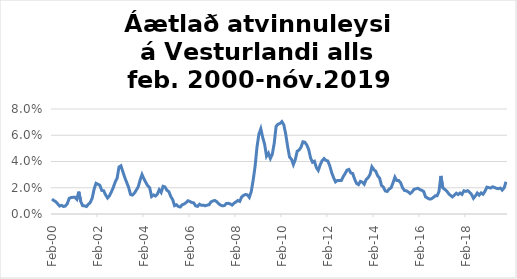
| Category | Series 0 |
|---|---|
| 2000-02-01 | 0.011 |
| 2000-03-01 | 0.01 |
| 2000-04-01 | 0.009 |
| 2000-05-01 | 0.008 |
| 2000-06-01 | 0.006 |
| 2000-07-01 | 0.007 |
| 2000-08-01 | 0.006 |
| 2000-09-01 | 0.006 |
| 2000-10-01 | 0.008 |
| 2000-11-01 | 0.012 |
| 2000-12-01 | 0.013 |
| 2001-01-01 | 0.013 |
| 2001-02-01 | 0.013 |
| 2001-03-01 | 0.011 |
| 2001-04-01 | 0.017 |
| 2001-05-01 | 0.01 |
| 2001-06-01 | 0.006 |
| 2001-07-01 | 0.006 |
| 2001-08-01 | 0.006 |
| 2001-09-01 | 0.007 |
| 2001-10-01 | 0.009 |
| 2001-11-01 | 0.012 |
| 2001-12-01 | 0.019 |
| 2002-01-01 | 0.023 |
| 2002-02-01 | 0.023 |
| 2002-03-01 | 0.022 |
| 2002-04-01 | 0.018 |
| 2002-05-01 | 0.018 |
| 2002-06-01 | 0.015 |
| 2002-07-01 | 0.012 |
| 2002-08-01 | 0.014 |
| 2002-09-01 | 0.017 |
| 2002-10-01 | 0.02 |
| 2002-11-01 | 0.024 |
| 2002-12-01 | 0.027 |
| 2003-01-01 | 0.036 |
| 2003-02-01 | 0.037 |
| 2003-03-01 | 0.032 |
| 2003-04-01 | 0.028 |
| 2003-05-01 | 0.024 |
| 2003-06-01 | 0.02 |
| 2003-07-01 | 0.015 |
| 2003-08-01 | 0.014 |
| 2003-09-01 | 0.016 |
| 2003-10-01 | 0.018 |
| 2003-11-01 | 0.021 |
| 2003-12-01 | 0.026 |
| 2004-01-01 | 0.03 |
| 2004-02-01 | 0.027 |
| 2004-03-01 | 0.024 |
| 2004-04-01 | 0.021 |
| 2004-05-01 | 0.02 |
| 2004-06-01 | 0.013 |
| 2004-07-01 | 0.014 |
| 2004-08-01 | 0.014 |
| 2004-09-01 | 0.015 |
| 2004-10-01 | 0.019 |
| 2004-11-01 | 0.016 |
| 2004-12-01 | 0.021 |
| 2005-01-01 | 0.021 |
| 2005-02-01 | 0.018 |
| 2005-03-01 | 0.017 |
| 2005-04-01 | 0.013 |
| 2005-05-01 | 0.011 |
| 2005-06-01 | 0.006 |
| 2005-07-01 | 0.007 |
| 2005-08-01 | 0.006 |
| 2005-09-01 | 0.005 |
| 2005-10-01 | 0.007 |
| 2005-11-01 | 0.008 |
| 2005-12-01 | 0.009 |
| 2006-01-01 | 0.01 |
| 2006-02-01 | 0.009 |
| 2006-03-01 | 0.009 |
| 2006-04-01 | 0.008 |
| 2006-05-01 | 0.006 |
| 2006-06-01 | 0.006 |
| 2006-07-01 | 0.007 |
| 2006-08-01 | 0.007 |
| 2006-09-01 | 0.007 |
| 2006-10-01 | 0.006 |
| 2006-11-01 | 0.007 |
| 2006-12-01 | 0.007 |
| 2007-01-01 | 0.009 |
| 2007-02-01 | 0.01 |
| 2007-03-01 | 0.01 |
| 2007-04-01 | 0.009 |
| 2007-05-01 | 0.008 |
| 2007-06-01 | 0.007 |
| 2007-07-01 | 0.006 |
| 2007-08-01 | 0.006 |
| 2007-09-01 | 0.008 |
| 2007-10-01 | 0.008 |
| 2007-11-01 | 0.008 |
| 2007-12-01 | 0.007 |
| 2008-01-01 | 0.008 |
| 2008-02-01 | 0.009 |
| 2008-03-01 | 0.01 |
| 2008-04-01 | 0.01 |
| 2008-05-01 | 0.013 |
| 2008-06-01 | 0.014 |
| 2008-07-01 | 0.015 |
| 2008-08-01 | 0.015 |
| 2008-09-01 | 0.013 |
| 2008-10-01 | 0.017 |
| 2008-11-01 | 0.026 |
| 2008-12-01 | 0.036 |
| 2009-01-01 | 0.051 |
| 2009-02-01 | 0.061 |
| 2009-03-01 | 0.065 |
| 2009-04-01 | 0.058 |
| 2009-05-01 | 0.053 |
| 2009-06-01 | 0.044 |
| 2009-07-01 | 0.046 |
| 2009-08-01 | 0.042 |
| 2009-09-01 | 0.046 |
| 2009-10-01 | 0.054 |
| 2009-11-01 | 0.067 |
| 2009-12-01 | 0.068 |
| 2010-01-01 | 0.069 |
| 2010-02-01 | 0.07 |
| 2010-03-01 | 0.068 |
| 2010-04-01 | 0.061 |
| 2010-05-01 | 0.052 |
| 2010-06-01 | 0.043 |
| 2010-07-01 | 0.042 |
| 2010-08-01 | 0.038 |
| 2010-09-01 | 0.041 |
| 2010-10-01 | 0.048 |
| 2010-11-01 | 0.049 |
| 2010-12-01 | 0.051 |
| 2011-01-01 | 0.055 |
| 2011-02-01 | 0.055 |
| 2011-03-01 | 0.053 |
| 2011-04-01 | 0.049 |
| 2011-05-01 | 0.043 |
| 2011-06-01 | 0.039 |
| 2011-07-01 | 0.04 |
| 2011-08-01 | 0.035 |
| 2011-09-01 | 0.033 |
| 2011-10-01 | 0.037 |
| 2011-11-01 | 0.041 |
| 2011-12-01 | 0.042 |
| 2012-01-01 | 0.041 |
| 2012-02-01 | 0.04 |
| 2012-03-01 | 0.037 |
| 2012-04-01 | 0.031 |
| 2012-05-01 | 0.028 |
| 2012-06-01 | 0.024 |
| 2012-07-01 | 0.026 |
| 2012-08-01 | 0.025 |
| 2012-09-01 | 0.025 |
| 2012-10-01 | 0.028 |
| 2012-11-01 | 0.031 |
| 2012-12-01 | 0.033 |
| 2013-01-01 | 0.034 |
| 2013-02-01 | 0.031 |
| 2013-03-01 | 0.031 |
| 2013-04-01 | 0.026 |
| 2013-05-01 | 0.023 |
| 2013-06-01 | 0.022 |
| 2013-07-01 | 0.025 |
| 2013-08-01 | 0.024 |
| 2013-09-01 | 0.023 |
| 2013-10-01 | 0.026 |
| 2013-11-01 | 0.028 |
| 2013-12-01 | 0.03 |
| 2014-01-01 | 0.036 |
| 2014-02-01 | 0.034 |
| 2014-03-01 | 0.033 |
| 2014-04-01 | 0.029 |
| 2014-05-01 | 0.027 |
| 2014-06-01 | 0.022 |
| 2014-07-01 | 0.02 |
| 2014-08-01 | 0.018 |
| 2014-09-01 | 0.017 |
| 2014-10-01 | 0.019 |
| 2014-11-01 | 0.02 |
| 2014-12-01 | 0.024 |
| 2015-01-01 | 0.028 |
| 2015-02-01 | 0.025 |
| 2015-03-01 | 0.025 |
| 2015-04-01 | 0.024 |
| 2015-05-01 | 0.02 |
| 2015-06-01 | 0.018 |
| 2015-07-01 | 0.018 |
| 2015-08-01 | 0.017 |
| 2015-09-01 | 0.016 |
| 2015-10-01 | 0.017 |
| 2015-11-01 | 0.019 |
| 2015-12-01 | 0.019 |
| 2016-01-01 | 0.02 |
| 2016-02-01 | 0.019 |
| 2016-03-01 | 0.018 |
| 2016-04-01 | 0.017 |
| 2016-05-01 | 0.013 |
| 2016-06-01 | 0.012 |
| 2016-07-01 | 0.011 |
| 2016-08-01 | 0.012 |
| 2016-09-01 | 0.013 |
| 2016-10-01 | 0.014 |
| 2016-11-01 | 0.014 |
| 2016-12-01 | 0.017 |
| 2017-01-01 | 0.029 |
| 2017-02-01 | 0.02 |
| 2017-03-01 | 0.019 |
| 2017-04-01 | 0.018 |
| 2017-05-01 | 0.016 |
| 2017-06-01 | 0.014 |
| 2017-07-01 | 0.013 |
| 2017-08-01 | 0.014 |
| 2017-09-01 | 0.016 |
| 2017-10-01 | 0.015 |
| 2017-11-01 | 0.016 |
| 2017-12-01 | 0.015 |
| 2018-01-01 | 0.018 |
| 2018-02-01 | 0.017 |
| 2018-03-01 | 0.018 |
| 2018-04-01 | 0.017 |
| 2018-05-01 | 0.015 |
| 2018-06-01 | 0.012 |
| 2018-07-01 | 0.014 |
| 2018-08-01 | 0.016 |
| 2018-09-01 | 0.014 |
| 2018-10-01 | 0.016 |
| 2018-11-01 | 0.015 |
| 2018-12-01 | 0.017 |
| 2019-01-01 | 0.02 |
| 2019-02-01 | 0.02 |
| 2019-03-01 | 0.02 |
| 2019-04-01 | 0.021 |
| 2019-05-01 | 0.02 |
| 2019-06-01 | 0.02 |
| 2019-07-01 | 0.019 |
| 2019-08-01 | 0.02 |
| 2019-09-01 | 0.018 |
| 2019-10-01 | 0.02 |
| 2019-11-01 | 0.025 |